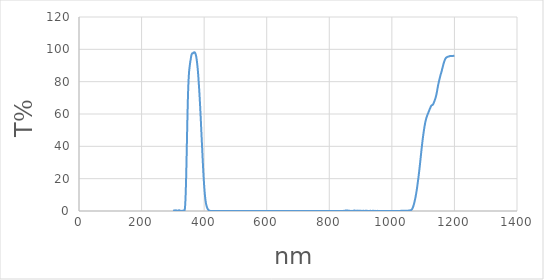
| Category | Series 0 |
|---|---|
| 1200.0 | 96.02 |
| 1199.0 | 95.99 |
| 1198.0 | 95.97 |
| 1197.0 | 95.97 |
| 1196.0 | 95.94 |
| 1195.0 | 95.89 |
| 1194.0 | 95.87 |
| 1193.0 | 95.81 |
| 1192.0 | 95.8 |
| 1191.0 | 95.83 |
| 1190.0 | 95.82 |
| 1189.0 | 95.85 |
| 1188.0 | 95.85 |
| 1187.0 | 95.88 |
| 1186.0 | 95.89 |
| 1185.0 | 95.79 |
| 1184.0 | 95.73 |
| 1183.0 | 95.66 |
| 1182.0 | 95.6 |
| 1181.0 | 95.5 |
| 1180.0 | 95.48 |
| 1179.0 | 95.42 |
| 1178.0 | 95.34 |
| 1177.0 | 95.27 |
| 1176.0 | 95.11 |
| 1175.0 | 95.06 |
| 1174.0 | 94.87 |
| 1173.0 | 94.72 |
| 1172.0 | 94.46 |
| 1171.0 | 94.11 |
| 1170.0 | 93.74 |
| 1169.0 | 93.23 |
| 1168.0 | 92.75 |
| 1167.0 | 92.16 |
| 1166.0 | 91.53 |
| 1165.0 | 90.93 |
| 1164.0 | 90.21 |
| 1163.0 | 89.45 |
| 1162.0 | 88.67 |
| 1161.0 | 87.96 |
| 1160.0 | 87.12 |
| 1159.0 | 86.38 |
| 1158.0 | 85.66 |
| 1157.0 | 85.04 |
| 1156.0 | 84.41 |
| 1155.0 | 83.66 |
| 1154.0 | 82.92 |
| 1153.0 | 82.13 |
| 1152.0 | 81.32 |
| 1151.0 | 80.55 |
| 1150.0 | 79.73 |
| 1149.0 | 78.82 |
| 1148.0 | 77.9 |
| 1147.0 | 76.92 |
| 1146.0 | 75.86 |
| 1145.0 | 74.72 |
| 1144.0 | 73.61 |
| 1143.0 | 72.62 |
| 1142.0 | 71.73 |
| 1141.0 | 70.96 |
| 1140.0 | 70.25 |
| 1139.0 | 69.59 |
| 1138.0 | 68.98 |
| 1137.0 | 68.43 |
| 1136.0 | 67.92 |
| 1135.0 | 67.43 |
| 1134.0 | 66.94 |
| 1133.0 | 66.45 |
| 1132.0 | 66.04 |
| 1131.0 | 65.74 |
| 1130.0 | 65.58 |
| 1129.0 | 65.52 |
| 1128.0 | 65.44 |
| 1127.0 | 65.29 |
| 1126.0 | 65.05 |
| 1125.0 | 64.78 |
| 1124.0 | 64.39 |
| 1123.0 | 63.9 |
| 1122.0 | 63.42 |
| 1121.0 | 62.98 |
| 1120.0 | 62.51 |
| 1119.0 | 62.05 |
| 1118.0 | 61.58 |
| 1117.0 | 61.02 |
| 1116.0 | 60.52 |
| 1115.0 | 60.06 |
| 1114.0 | 59.59 |
| 1113.0 | 59.09 |
| 1112.0 | 58.51 |
| 1111.0 | 57.98 |
| 1110.0 | 57.34 |
| 1109.0 | 56.61 |
| 1108.0 | 55.8 |
| 1107.0 | 54.96 |
| 1106.0 | 53.95 |
| 1105.0 | 52.9 |
| 1104.0 | 51.78 |
| 1103.0 | 50.55 |
| 1102.0 | 49.28 |
| 1101.0 | 47.9 |
| 1100.0 | 46.46 |
| 1099.0 | 44.97 |
| 1098.0 | 43.39 |
| 1097.0 | 41.8 |
| 1096.0 | 40.08 |
| 1095.0 | 38.34 |
| 1094.0 | 36.53 |
| 1093.0 | 34.71 |
| 1092.0 | 32.83 |
| 1091.0 | 30.99 |
| 1090.0 | 29.15 |
| 1089.0 | 27.37 |
| 1088.0 | 25.65 |
| 1087.0 | 23.96 |
| 1086.0 | 22.36 |
| 1085.0 | 20.79 |
| 1084.0 | 19.28 |
| 1083.0 | 17.81 |
| 1082.0 | 16.34 |
| 1081.0 | 14.94 |
| 1080.0 | 13.59 |
| 1079.0 | 12.33 |
| 1078.0 | 11.13 |
| 1077.0 | 10.01 |
| 1076.0 | 8.96 |
| 1075.0 | 7.97 |
| 1074.0 | 7.05 |
| 1073.0 | 6.16 |
| 1072.0 | 5.35 |
| 1071.0 | 4.58 |
| 1070.0 | 3.87 |
| 1069.0 | 3.22 |
| 1068.0 | 2.62 |
| 1067.0 | 2.11 |
| 1066.0 | 1.67 |
| 1065.0 | 1.31 |
| 1064.0 | 1.01 |
| 1063.0 | 0.8 |
| 1062.0 | 0.65 |
| 1061.0 | 0.55 |
| 1060.0 | 0.48 |
| 1059.0 | 0.43 |
| 1058.0 | 0.4 |
| 1057.0 | 0.37 |
| 1056.0 | 0.35 |
| 1055.0 | 0.32 |
| 1054.0 | 0.29 |
| 1053.0 | 0.25 |
| 1052.0 | 0.22 |
| 1051.0 | 0.21 |
| 1050.0 | 0.18 |
| 1049.0 | 0.17 |
| 1048.0 | 0.17 |
| 1047.0 | 0.17 |
| 1046.0 | 0.17 |
| 1045.0 | 0.16 |
| 1044.0 | 0.15 |
| 1043.0 | 0.13 |
| 1042.0 | 0.12 |
| 1041.0 | 0.1 |
| 1040.0 | 0.09 |
| 1039.0 | 0.1 |
| 1038.0 | 0.1 |
| 1037.0 | 0.1 |
| 1036.0 | 0.1 |
| 1035.0 | 0.1 |
| 1034.0 | 0.11 |
| 1033.0 | 0.1 |
| 1032.0 | 0.1 |
| 1031.0 | 0.09 |
| 1030.0 | 0.08 |
| 1029.0 | 0.09 |
| 1028.0 | 0.08 |
| 1027.0 | 0.07 |
| 1026.0 | 0.07 |
| 1025.0 | 0.06 |
| 1024.0 | 0.05 |
| 1023.0 | 0.04 |
| 1022.0 | 0.05 |
| 1021.0 | 0.05 |
| 1020.0 | 0.06 |
| 1019.0 | 0.07 |
| 1018.0 | 0.07 |
| 1017.0 | 0.07 |
| 1016.0 | 0.06 |
| 1015.0 | 0.05 |
| 1014.0 | 0.03 |
| 1013.0 | 0.03 |
| 1012.0 | 0.04 |
| 1011.0 | 0.03 |
| 1010.0 | 0.03 |
| 1009.0 | 0.03 |
| 1008.0 | 0.03 |
| 1007.0 | 0.03 |
| 1006.0 | 0.03 |
| 1005.0 | 0.02 |
| 1004.0 | 0.03 |
| 1003.0 | 0.03 |
| 1002.0 | 0.04 |
| 1001.0 | 0.04 |
| 1000.0 | 0.04 |
| 999.0 | 0.04 |
| 998.0 | 0.04 |
| 997.0 | 0.04 |
| 996.0 | 0.04 |
| 995.0 | 0.03 |
| 994.0 | 0.01 |
| 993.0 | 0 |
| 992.0 | 0.01 |
| 991.0 | 0.04 |
| 990.0 | 0.04 |
| 989.0 | 0.06 |
| 988.0 | 0.07 |
| 987.0 | 0.05 |
| 986.0 | 0.02 |
| 985.0 | 0 |
| 984.0 | 0.02 |
| 983.0 | 0.01 |
| 982.0 | 0 |
| 981.0 | 0 |
| 980.0 | 0.01 |
| 979.0 | 0.02 |
| 978.0 | 0.02 |
| 977.0 | 0.03 |
| 976.0 | 0.05 |
| 975.0 | 0.04 |
| 974.0 | 0.02 |
| 973.0 | 0.01 |
| 972.0 | 0 |
| 971.0 | 0.01 |
| 970.0 | 0.01 |
| 969.0 | 0.01 |
| 968.0 | 0.01 |
| 967.0 | 0 |
| 966.0 | 0 |
| 965.0 | 0.01 |
| 964.0 | 0.02 |
| 963.0 | 0.02 |
| 962.0 | 0.02 |
| 961.0 | 0.05 |
| 960.0 | 0.06 |
| 959.0 | 0.07 |
| 958.0 | 0.06 |
| 957.0 | 0.07 |
| 956.0 | 0.07 |
| 955.0 | 0.06 |
| 954.0 | 0.07 |
| 953.0 | 0.08 |
| 952.0 | 0.07 |
| 951.0 | 0.06 |
| 950.0 | 0.07 |
| 949.0 | 0.06 |
| 948.0 | 0.06 |
| 947.0 | 0.07 |
| 946.0 | 0.08 |
| 945.0 | 0.07 |
| 944.0 | 0.05 |
| 943.0 | 0.07 |
| 942.0 | 0.08 |
| 941.0 | 0.1 |
| 940.0 | 0.1 |
| 939.0 | 0.09 |
| 938.0 | 0.09 |
| 937.0 | 0.07 |
| 936.0 | 0.05 |
| 935.0 | 0.03 |
| 934.0 | 0.03 |
| 933.0 | 0.07 |
| 932.0 | 0.1 |
| 931.0 | 0.12 |
| 930.0 | 0.1 |
| 929.0 | 0.07 |
| 928.0 | 0.07 |
| 927.0 | 0.06 |
| 926.0 | 0.05 |
| 925.0 | 0.05 |
| 924.0 | 0.06 |
| 923.0 | 0.07 |
| 922.0 | 0.08 |
| 921.0 | 0.09 |
| 920.0 | 0.11 |
| 919.0 | 0.14 |
| 918.0 | 0.16 |
| 917.0 | 0.16 |
| 916.0 | 0.14 |
| 915.0 | 0.1 |
| 914.0 | 0.07 |
| 913.0 | 0.06 |
| 912.0 | 0.04 |
| 911.0 | 0.08 |
| 910.0 | 0.11 |
| 909.0 | 0.13 |
| 908.0 | 0.14 |
| 907.0 | 0.06 |
| 906.0 | 0.04 |
| 905.0 | 0.05 |
| 904.0 | 0.06 |
| 903.0 | 0.08 |
| 902.0 | 0.06 |
| 901.0 | 0.07 |
| 900.0 | 0.1 |
| 899.0 | 0.13 |
| 898.0 | 0.15 |
| 897.0 | 0.14 |
| 896.0 | 0.14 |
| 895.0 | 0.14 |
| 894.0 | 0.12 |
| 893.0 | 0.05 |
| 892.0 | 0.09 |
| 891.0 | 0.1 |
| 890.0 | 0.15 |
| 889.0 | 0.24 |
| 888.0 | 0.21 |
| 887.0 | 0.22 |
| 886.0 | 0.23 |
| 885.0 | 0.2 |
| 884.0 | 0.22 |
| 883.0 | 0.18 |
| 882.0 | 0.21 |
| 881.0 | 0.27 |
| 880.0 | 0.27 |
| 879.0 | 0.24 |
| 878.0 | 0.19 |
| 877.0 | 0.11 |
| 876.0 | 0.09 |
| 875.0 | 0.03 |
| 874.0 | 0.01 |
| 873.0 | 0.01 |
| 872.0 | 0.01 |
| 871.0 | 0.01 |
| 870.0 | 0.09 |
| 869.0 | 0.03 |
| 868.0 | 0.02 |
| 867.0 | 0.04 |
| 866.0 | 0.08 |
| 865.0 | 0.21 |
| 864.0 | 0.15 |
| 863.0 | 0.12 |
| 862.0 | 0.16 |
| 861.0 | 0.17 |
| 860.0 | 0.21 |
| 859.0 | 0.34 |
| 858.0 | 0.29 |
| 857.0 | 0.31 |
| 856.0 | 0.36 |
| 855.0 | 0.32 |
| 854.0 | 0.31 |
| 853.0 | 0.27 |
| 852.0 | 0.22 |
| 851.0 | 0.26 |
| 850.0 | 0.2 |
| 849.0 | 0.1 |
| 848.0 | 0.04 |
| 847.0 | 0.02 |
| 846.0 | 0.1 |
| 845.0 | 0.02 |
| 844.0 | 0.05 |
| 843.0 | 0 |
| 842.0 | 0 |
| 841.0 | 0.01 |
| 840.0 | 0.03 |
| 839.0 | 0.06 |
| 838.0 | 0.05 |
| 837.0 | 0.03 |
| 836.0 | 0.02 |
| 835.0 | 0.01 |
| 834.0 | 0.02 |
| 833.0 | 0.03 |
| 832.0 | 0.04 |
| 831.0 | 0.04 |
| 830.0 | 0.03 |
| 829.0 | 0.01 |
| 828.0 | 0.01 |
| 827.0 | 0.01 |
| 826.0 | 0 |
| 825.0 | 0.01 |
| 824.0 | 0 |
| 823.0 | 0.01 |
| 822.0 | 0.01 |
| 821.0 | 0.02 |
| 820.0 | 0.02 |
| 819.0 | 0.02 |
| 818.0 | 0.02 |
| 817.0 | 0.02 |
| 816.0 | 0.03 |
| 815.0 | 0.02 |
| 814.0 | 0.01 |
| 813.0 | 0.01 |
| 812.0 | 0.01 |
| 811.0 | 0.01 |
| 810.0 | 0.01 |
| 809.0 | 0.02 |
| 808.0 | 0.01 |
| 807.0 | 0.01 |
| 806.0 | 0.02 |
| 805.0 | 0.01 |
| 804.0 | 0 |
| 803.0 | 0 |
| 802.0 | 0 |
| 801.0 | 0.01 |
| 800.0 | 0.01 |
| 799.0 | 0.01 |
| 798.0 | 0.01 |
| 797.0 | 0.01 |
| 796.0 | 0.02 |
| 795.0 | 0.02 |
| 794.0 | 0.02 |
| 793.0 | 0.02 |
| 792.0 | 0.01 |
| 791.0 | 0.01 |
| 790.0 | 0.01 |
| 789.0 | 0.01 |
| 788.0 | 0 |
| 787.0 | 0.01 |
| 786.0 | 0.01 |
| 785.0 | 0.01 |
| 784.0 | 0.01 |
| 783.0 | 0.01 |
| 782.0 | 0.01 |
| 781.0 | 0.01 |
| 780.0 | 0.01 |
| 779.0 | 0.01 |
| 778.0 | 0 |
| 777.0 | 0 |
| 776.0 | 0 |
| 775.0 | 0 |
| 774.0 | 0 |
| 773.0 | 0 |
| 772.0 | 0 |
| 771.0 | 0 |
| 770.0 | 0 |
| 769.0 | 0.01 |
| 768.0 | 0 |
| 767.0 | 0 |
| 766.0 | 0 |
| 765.0 | 0.01 |
| 764.0 | 0.01 |
| 763.0 | 0.01 |
| 762.0 | 0.01 |
| 761.0 | 0.01 |
| 760.0 | 0.01 |
| 759.0 | 0.01 |
| 758.0 | 0.01 |
| 757.0 | 0.01 |
| 756.0 | 0.01 |
| 755.0 | 0.01 |
| 754.0 | 0.01 |
| 753.0 | 0.01 |
| 752.0 | 0.01 |
| 751.0 | 0 |
| 750.0 | 0 |
| 749.0 | 0 |
| 748.0 | 0.01 |
| 747.0 | 0 |
| 746.0 | 0.01 |
| 745.0 | 0.01 |
| 744.0 | 0.01 |
| 743.0 | 0.01 |
| 742.0 | 0.01 |
| 741.0 | 0.01 |
| 740.0 | 0.01 |
| 739.0 | 0.01 |
| 738.0 | 0.01 |
| 737.0 | 0.01 |
| 736.0 | 0.01 |
| 735.0 | 0.01 |
| 734.0 | 0.01 |
| 733.0 | 0.01 |
| 732.0 | 0.01 |
| 731.0 | 0.01 |
| 730.0 | 0.01 |
| 729.0 | 0.01 |
| 728.0 | 0.01 |
| 727.0 | 0.02 |
| 726.0 | 0.02 |
| 725.0 | 0.02 |
| 724.0 | 0.02 |
| 723.0 | 0.02 |
| 722.0 | 0.02 |
| 721.0 | 0.01 |
| 720.0 | 0.01 |
| 719.0 | 0.01 |
| 718.0 | 0.02 |
| 717.0 | 0.02 |
| 716.0 | 0.02 |
| 715.0 | 0.02 |
| 714.0 | 0.02 |
| 713.0 | 0.01 |
| 712.0 | 0.01 |
| 711.0 | 0.01 |
| 710.0 | 0.01 |
| 709.0 | 0.01 |
| 708.0 | 0.01 |
| 707.0 | 0.01 |
| 706.0 | 0.01 |
| 705.0 | 0.02 |
| 704.0 | 0.02 |
| 703.0 | 0.01 |
| 702.0 | 0.01 |
| 701.0 | 0.01 |
| 700.0 | 0.01 |
| 699.0 | 0.01 |
| 698.0 | 0.01 |
| 697.0 | 0.01 |
| 696.0 | 0.01 |
| 695.0 | 0.01 |
| 694.0 | 0.01 |
| 693.0 | 0.01 |
| 692.0 | 0.01 |
| 691.0 | 0.01 |
| 690.0 | 0.01 |
| 689.0 | 0.01 |
| 688.0 | 0.01 |
| 687.0 | 0.01 |
| 686.0 | 0.01 |
| 685.0 | 0.01 |
| 684.0 | 0.01 |
| 683.0 | 0.01 |
| 682.0 | 0 |
| 681.0 | 0 |
| 680.0 | 0 |
| 679.0 | 0.01 |
| 678.0 | 0.01 |
| 677.0 | 0.01 |
| 676.0 | 0 |
| 675.0 | 0 |
| 674.0 | 0 |
| 673.0 | 0 |
| 672.0 | 0 |
| 671.0 | 0 |
| 670.0 | 0 |
| 669.0 | 0 |
| 668.0 | 0 |
| 667.0 | 0 |
| 666.0 | 0 |
| 665.0 | 0.01 |
| 664.0 | 0.01 |
| 663.0 | 0.02 |
| 662.0 | 0.02 |
| 661.0 | 0.02 |
| 660.0 | 0.03 |
| 659.0 | 0.03 |
| 658.0 | 0.03 |
| 657.0 | 0.03 |
| 656.0 | 0.03 |
| 655.0 | 0.03 |
| 654.0 | 0.02 |
| 653.0 | 0.02 |
| 652.0 | 0.02 |
| 651.0 | 0.02 |
| 650.0 | 0.01 |
| 649.0 | 0.01 |
| 648.0 | 0.01 |
| 647.0 | 0.01 |
| 646.0 | 0.01 |
| 645.0 | 0.01 |
| 644.0 | 0.01 |
| 643.0 | 0.01 |
| 642.0 | 0.01 |
| 641.0 | 0.01 |
| 640.0 | 0.01 |
| 639.0 | 0.01 |
| 638.0 | 0.01 |
| 637.0 | 0.01 |
| 636.0 | 0.01 |
| 635.0 | 0.01 |
| 634.0 | 0.01 |
| 633.0 | 0.01 |
| 632.0 | 0.01 |
| 631.0 | 0.01 |
| 630.0 | 0.01 |
| 629.0 | 0.01 |
| 628.0 | 0.01 |
| 627.0 | 0.01 |
| 626.0 | 0.01 |
| 625.0 | 0.02 |
| 624.0 | 0.02 |
| 623.0 | 0.02 |
| 622.0 | 0.01 |
| 621.0 | 0.01 |
| 620.0 | 0.01 |
| 619.0 | 0.01 |
| 618.0 | 0.01 |
| 617.0 | 0.01 |
| 616.0 | 0.01 |
| 615.0 | 0.01 |
| 614.0 | 0.01 |
| 613.0 | 0.01 |
| 612.0 | 0.01 |
| 611.0 | 0.01 |
| 610.0 | 0.01 |
| 609.0 | 0.02 |
| 608.0 | 0.02 |
| 607.0 | 0.02 |
| 606.0 | 0.02 |
| 605.0 | 0.02 |
| 604.0 | 0.02 |
| 603.0 | 0.02 |
| 602.0 | 0.02 |
| 601.0 | 0.02 |
| 600.0 | 0.02 |
| 599.0 | 0.02 |
| 598.0 | 0.01 |
| 597.0 | 0.01 |
| 596.0 | 0.01 |
| 595.0 | 0.02 |
| 594.0 | 0.01 |
| 593.0 | 0.01 |
| 592.0 | 0.02 |
| 591.0 | 0.01 |
| 590.0 | 0.01 |
| 589.0 | 0.02 |
| 588.0 | 0.02 |
| 587.0 | 0.02 |
| 586.0 | 0.02 |
| 585.0 | 0.02 |
| 584.0 | 0.01 |
| 583.0 | 0.01 |
| 582.0 | 0.01 |
| 581.0 | 0.01 |
| 580.0 | 0.01 |
| 579.0 | 0.01 |
| 578.0 | 0.01 |
| 577.0 | 0.01 |
| 576.0 | 0.01 |
| 575.0 | 0.01 |
| 574.0 | 0.01 |
| 573.0 | 0.01 |
| 572.0 | 0.02 |
| 571.0 | 0.02 |
| 570.0 | 0.01 |
| 569.0 | 0.01 |
| 568.0 | 0.01 |
| 567.0 | 0.01 |
| 566.0 | 0.01 |
| 565.0 | 0.01 |
| 564.0 | 0.01 |
| 563.0 | 0.01 |
| 562.0 | 0.01 |
| 561.0 | 0.01 |
| 560.0 | 0.01 |
| 559.0 | 0.01 |
| 558.0 | 0.01 |
| 557.0 | 0.01 |
| 556.0 | 0.01 |
| 555.0 | 0.01 |
| 554.0 | 0.01 |
| 553.0 | 0.01 |
| 552.0 | 0.01 |
| 551.0 | 0.01 |
| 550.0 | 0.01 |
| 549.0 | 0.01 |
| 548.0 | 0.01 |
| 547.0 | 0.01 |
| 546.0 | 0.01 |
| 545.0 | 0.01 |
| 544.0 | 0.01 |
| 543.0 | 0.01 |
| 542.0 | 0 |
| 541.0 | 0.01 |
| 540.0 | 0.01 |
| 539.0 | 0.01 |
| 538.0 | 0.01 |
| 537.0 | 0.01 |
| 536.0 | 0.01 |
| 535.0 | 0.02 |
| 534.0 | 0.02 |
| 533.0 | 0.02 |
| 532.0 | 0.02 |
| 531.0 | 0.01 |
| 530.0 | 0.01 |
| 529.0 | 0.01 |
| 528.0 | 0.01 |
| 527.0 | 0.01 |
| 526.0 | 0.01 |
| 525.0 | 0.01 |
| 524.0 | 0.02 |
| 523.0 | 0.02 |
| 522.0 | 0.01 |
| 521.0 | 0.02 |
| 520.0 | 0.02 |
| 519.0 | 0.01 |
| 518.0 | 0.01 |
| 517.0 | 0.01 |
| 516.0 | 0.02 |
| 515.0 | 0.02 |
| 514.0 | 0.01 |
| 513.0 | 0.02 |
| 512.0 | 0.01 |
| 511.0 | 0.01 |
| 510.0 | 0.01 |
| 509.0 | 0.01 |
| 508.0 | 0.01 |
| 507.0 | 0.01 |
| 506.0 | 0.01 |
| 505.0 | 0.01 |
| 504.0 | 0.01 |
| 503.0 | 0.01 |
| 502.0 | 0.02 |
| 501.0 | 0.01 |
| 500.0 | 0.01 |
| 499.0 | 0.01 |
| 498.0 | 0.01 |
| 497.0 | 0.01 |
| 496.0 | 0.01 |
| 495.0 | 0.01 |
| 494.0 | 0.01 |
| 493.0 | 0.01 |
| 492.0 | 0.01 |
| 491.0 | 0.01 |
| 490.0 | 0 |
| 489.0 | 0.01 |
| 488.0 | 0.01 |
| 487.0 | 0.01 |
| 486.0 | 0.01 |
| 485.0 | 0.01 |
| 484.0 | 0.01 |
| 483.0 | 0.01 |
| 482.0 | 0.01 |
| 481.0 | 0 |
| 480.0 | 0.01 |
| 479.0 | 0.01 |
| 478.0 | 0.01 |
| 477.0 | 0.01 |
| 476.0 | 0.01 |
| 475.0 | 0.01 |
| 474.0 | 0.02 |
| 473.0 | 0.01 |
| 472.0 | 0.02 |
| 471.0 | 0.01 |
| 470.0 | 0.02 |
| 469.0 | 0.02 |
| 468.0 | 0.02 |
| 467.0 | 0.02 |
| 466.0 | 0.03 |
| 465.0 | 0.04 |
| 464.0 | 0.04 |
| 463.0 | 0.03 |
| 462.0 | 0.02 |
| 461.0 | 0.01 |
| 460.0 | 0.01 |
| 459.0 | 0.01 |
| 458.0 | 0.01 |
| 457.0 | 0.01 |
| 456.0 | 0.02 |
| 455.0 | 0.02 |
| 454.0 | 0.01 |
| 453.0 | 0.01 |
| 452.0 | 0.01 |
| 451.0 | 0.01 |
| 450.0 | 0.01 |
| 449.0 | 0.01 |
| 448.0 | 0.01 |
| 447.0 | 0.02 |
| 446.0 | 0.02 |
| 445.0 | 0.02 |
| 444.0 | 0.02 |
| 443.0 | 0.02 |
| 442.0 | 0.02 |
| 441.0 | 0.02 |
| 440.0 | 0.02 |
| 439.0 | 0.02 |
| 438.0 | 0.01 |
| 437.0 | 0.01 |
| 436.0 | 0.02 |
| 435.0 | 0.02 |
| 434.0 | 0.02 |
| 433.0 | 0.02 |
| 432.0 | 0.02 |
| 431.0 | 0.02 |
| 430.0 | 0.01 |
| 429.0 | 0.01 |
| 428.0 | 0.01 |
| 427.0 | 0.02 |
| 426.0 | 0.02 |
| 425.0 | 0.02 |
| 424.0 | 0.02 |
| 423.0 | 0.01 |
| 422.0 | 0.01 |
| 421.0 | 0.01 |
| 420.0 | 0.03 |
| 419.0 | 0.07 |
| 418.0 | 0.12 |
| 417.0 | 0.2 |
| 416.0 | 0.31 |
| 415.0 | 0.46 |
| 414.0 | 0.63 |
| 413.0 | 0.83 |
| 412.0 | 1.09 |
| 411.0 | 1.42 |
| 410.0 | 1.84 |
| 409.0 | 2.33 |
| 408.0 | 2.93 |
| 407.0 | 3.68 |
| 406.0 | 4.6 |
| 405.0 | 5.75 |
| 404.0 | 7.15 |
| 403.0 | 8.83 |
| 402.0 | 10.84 |
| 401.0 | 13.21 |
| 400.0 | 15.88 |
| 399.0 | 18.81 |
| 398.0 | 22.06 |
| 397.0 | 25.55 |
| 396.0 | 29.35 |
| 395.0 | 33.31 |
| 394.0 | 37.31 |
| 393.0 | 41.34 |
| 392.0 | 45.38 |
| 391.0 | 49.56 |
| 390.0 | 53.7 |
| 389.0 | 57.81 |
| 388.0 | 61.72 |
| 387.0 | 65.54 |
| 386.0 | 69.14 |
| 385.0 | 72.48 |
| 384.0 | 75.7 |
| 383.0 | 78.67 |
| 382.0 | 81.43 |
| 381.0 | 84.32 |
| 380.0 | 86.71 |
| 379.0 | 88.82 |
| 378.0 | 90.65 |
| 377.0 | 92.33 |
| 376.0 | 93.95 |
| 375.0 | 95.12 |
| 374.0 | 96.1 |
| 373.0 | 96.93 |
| 372.0 | 97.49 |
| 371.0 | 97.81 |
| 370.0 | 98.1 |
| 369.0 | 98.14 |
| 368.0 | 97.92 |
| 367.0 | 98.03 |
| 366.0 | 98.04 |
| 365.0 | 97.78 |
| 364.0 | 97.55 |
| 363.0 | 97.47 |
| 362.0 | 97.5 |
| 361.0 | 97.26 |
| 360.0 | 96.78 |
| 359.0 | 96.18 |
| 358.0 | 95.05 |
| 357.0 | 93.72 |
| 356.0 | 92.67 |
| 355.0 | 91.31 |
| 354.0 | 89.9 |
| 353.0 | 88.27 |
| 352.0 | 86.49 |
| 351.0 | 83.68 |
| 350.0 | 80.11 |
| 349.0 | 75.33 |
| 348.0 | 68.98 |
| 347.0 | 61.32 |
| 346.0 | 52.53 |
| 345.0 | 43.33 |
| 344.0 | 33.83 |
| 343.0 | 24.83 |
| 342.0 | 17.1 |
| 341.0 | 10.58 |
| 340.0 | 5.88 |
| 339.0 | 2.63 |
| 338.0 | 0.8 |
| 337.0 | 0.26 |
| 336.0 | 0.54 |
| 335.0 | 0.38 |
| 334.0 | 0.13 |
| 333.0 | 0.02 |
| 332.0 | 0.15 |
| 331.0 | 0.14 |
| 330.0 | 0.08 |
| 329.0 | 0.04 |
| 328.0 | 0.08 |
| 327.0 | 0.07 |
| 326.0 | 0.07 |
| 325.0 | 0.03 |
| 324.0 | 0.1 |
| 323.0 | 0.19 |
| 322.0 | 0.24 |
| 321.0 | 0.42 |
| 320.0 | 0.43 |
| 319.0 | 0.41 |
| 318.0 | 0.36 |
| 317.0 | 0.26 |
| 316.0 | 0.22 |
| 315.0 | 0.06 |
| 314.0 | 0.09 |
| 313.0 | 0.19 |
| 312.0 | 0.28 |
| 311.0 | 0.33 |
| 310.0 | 0.42 |
| 309.0 | 0.35 |
| 308.0 | 0.29 |
| 307.0 | 0.34 |
| 306.0 | 0.34 |
| 305.0 | 0.4 |
| 304.0 | 0.34 |
| 303.0 | 0.22 |
| 302.0 | 0.15 |
| 301.0 | 0.07 |
| 300.0 | 0.2 |